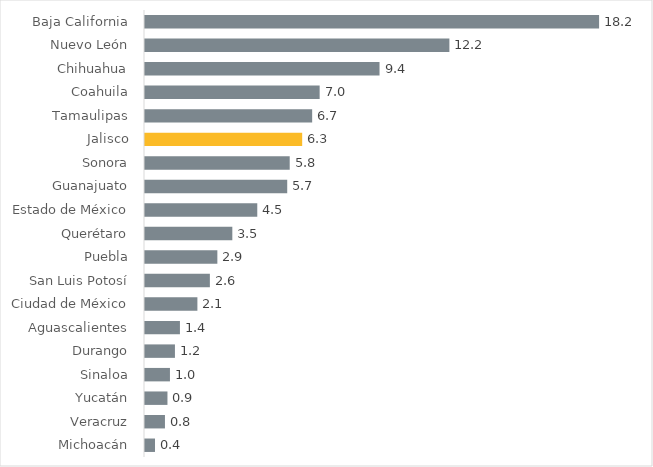
| Category | Series 0 |
|---|---|
| Michoacán | 0.4 |
| Veracruz | 0.8 |
| Yucatán | 0.9 |
| Sinaloa | 1 |
| Durango | 1.2 |
| Aguascalientes | 1.4 |
| Ciudad de México | 2.1 |
| San Luis Potosí | 2.6 |
| Puebla | 2.9 |
| Querétaro | 3.5 |
| Estado de México | 4.5 |
| Guanajuato | 5.7 |
| Sonora | 5.8 |
| Jalisco | 6.3 |
| Tamaulipas | 6.7 |
| Coahuila | 7 |
| Chihuahua | 9.4 |
| Nuevo León | 12.2 |
| Baja California | 18.2 |